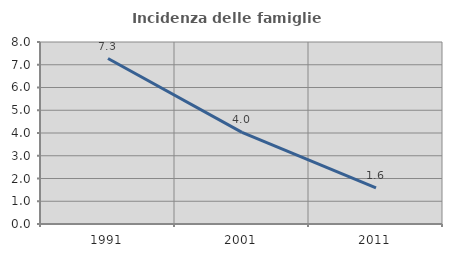
| Category | Incidenza delle famiglie numerose |
|---|---|
| 1991.0 | 7.273 |
| 2001.0 | 4.026 |
| 2011.0 | 1.584 |